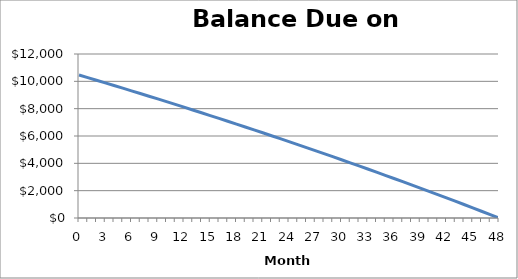
| Category | Series 0 |
|---|---|
| 0.0 | 10460.305 |
| 1.0 | 10270.455 |
| 2.0 | 10079.515 |
| 3.0 | 9887.475 |
| 4.0 | 9694.325 |
| 5.0 | 9500.065 |
| 6.0 | 9304.695 |
| 7.0 | 9108.195 |
| 8.0 | 8910.565 |
| 9.0 | 8711.805 |
| 10.0 | 8511.895 |
| 11.0 | 8310.835 |
| 12.0 | 8108.625 |
| 13.0 | 7905.245 |
| 14.0 | 7700.705 |
| 15.0 | 7494.985 |
| 16.0 | 7288.085 |
| 17.0 | 7079.995 |
| 18.0 | 6870.705 |
| 19.0 | 6660.215 |
| 20.0 | 6448.515 |
| 21.0 | 6235.595 |
| 22.0 | 6021.445 |
| 23.0 | 5806.065 |
| 24.0 | 5589.445 |
| 25.0 | 5371.585 |
| 26.0 | 5152.475 |
| 27.0 | 4932.105 |
| 28.0 | 4710.465 |
| 29.0 | 4487.555 |
| 30.0 | 4263.355 |
| 31.0 | 4037.865 |
| 32.0 | 3811.085 |
| 33.0 | 3582.995 |
| 34.0 | 3353.595 |
| 35.0 | 3122.875 |
| 36.0 | 2890.835 |
| 37.0 | 2657.455 |
| 38.0 | 2422.735 |
| 39.0 | 2186.665 |
| 40.0 | 1949.235 |
| 41.0 | 1710.445 |
| 42.0 | 1470.285 |
| 43.0 | 1228.735 |
| 44.0 | 985.805 |
| 45.0 | 741.475 |
| 46.0 | 495.735 |
| 47.0 | 248.585 |
| 48.0 | 0 |